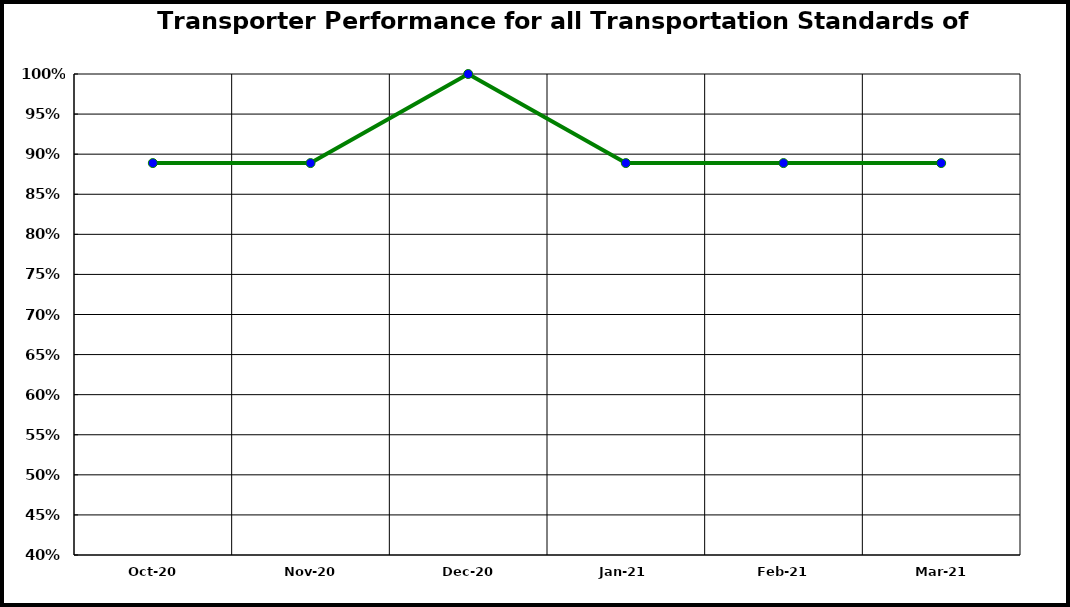
| Category | Performance |
|---|---|
| 2020-10-01 | 0.889 |
| 2020-11-01 | 0.889 |
| 2020-12-01 | 1 |
| 2021-01-01 | 0.889 |
| 2021-02-01 | 0.889 |
| 2021-03-01 | 0.889 |